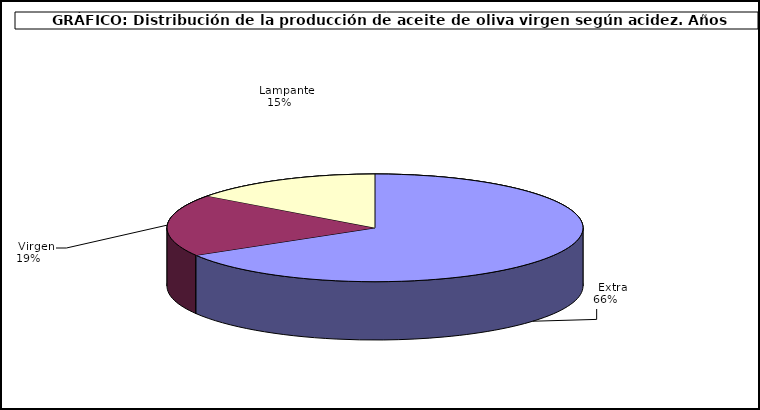
| Category | Series 0 |
|---|---|
|    Extra | 924879 |
|    Virgen | 259000 |
|    Lampante | 206985 |